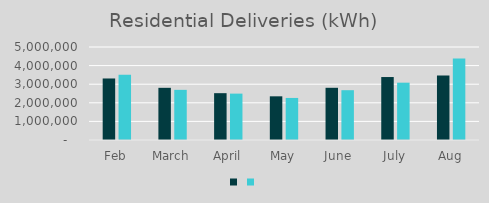
| Category | Series 1 | Series 0 |
|---|---|---|
| Feb | 3307618 | 3510451 |
| March | 2805250 | 2696163 |
| April | 2517652 | 2493703 |
| May | 2348338 | 2261286 |
| June | 2806791 | 2677737 |
| July | 3385366 | 3081914 |
| Aug | 3470448 | 4380548 |